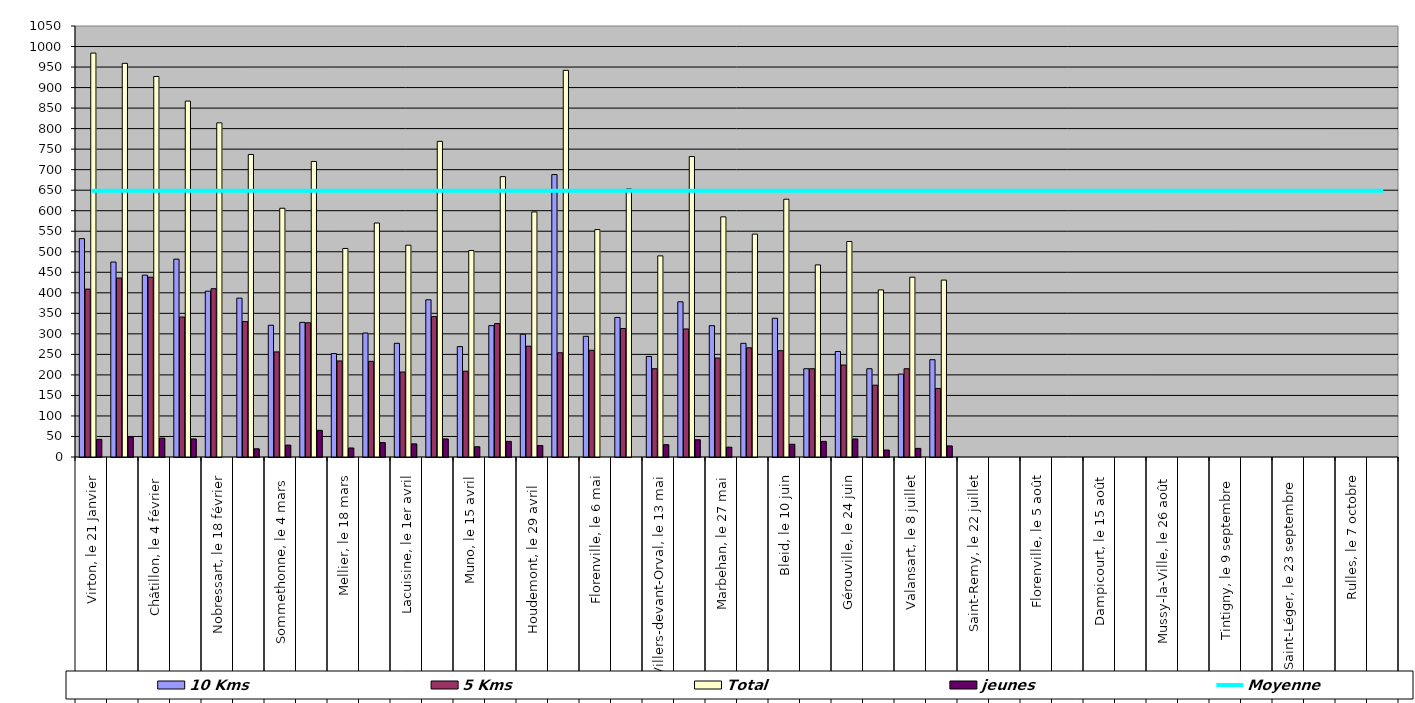
| Category | 10 Kms | 5 Kms | Total | jeunes |
|---|---|---|---|---|
| 0 | 532 | 409 | 984 | 43 |
| 1 | 475 | 436 | 959 | 48 |
| 2 | 443 | 438 | 927 | 46 |
| 3 | 482 | 341 | 867 | 44 |
| 4 | 404 | 410 | 814 | 0 |
| 5 | 387 | 330 | 737 | 20 |
| 6 | 321 | 256 | 606 | 29 |
| 7 | 328 | 327 | 720 | 65 |
| 8 | 252 | 234 | 508 | 22 |
| 9 | 302 | 233 | 570 | 35 |
| 10 | 277 | 207 | 516 | 32 |
| 11 | 383 | 342 | 769 | 44 |
| 12 | 269 | 209 | 503 | 25 |
| 13 | 320 | 325 | 683 | 38 |
| 14 | 299 | 270 | 597 | 28 |
| 15 | 688 | 254 | 942 | 0 |
| 16 | 294 | 260 | 554 | 0 |
| 17 | 340 | 313 | 653 | 0 |
| 18 | 245 | 215 | 490 | 30 |
| 19 | 378 | 312 | 732 | 42 |
| 20 | 320 | 241 | 585 | 24 |
| 21 | 277 | 266 | 543 | 0 |
| 22 | 338 | 259 | 628 | 31 |
| 23 | 215 | 215 | 468 | 38 |
| 24 | 257 | 224 | 525 | 44 |
| 25 | 215 | 175 | 407 | 17 |
| 26 | 202 | 215 | 438 | 21 |
| 27 | 237 | 167 | 431 | 27 |
| 28 | 0 | 0 | 0 | 0 |
| 29 | 0 | 0 | 0 | 0 |
| 30 | 0 | 0 | 0 | 0 |
| 31 | 0 | 0 | 0 | 0 |
| 32 | 0 | 0 | 0 | 0 |
| 33 | 0 | 0 | 0 | 0 |
| 34 | 0 | 0 | 0 | 0 |
| 35 | 0 | 0 | 0 | 0 |
| 36 | 0 | 0 | 0 | 0 |
| 37 | 0 | 0 | 0 | 0 |
| 38 | 0 | 0 | 0 | 0 |
| 39 | 0 | 0 | 0 | 0 |
| 40 | 0 | 0 | 0 | 0 |
| 41 | 0 | 0 | 0 | 0 |